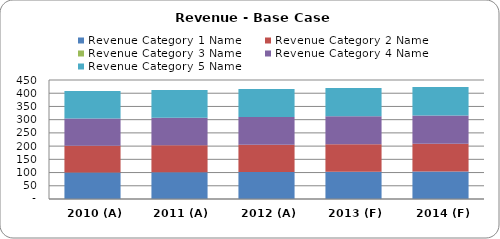
| Category | Revenue Category 1 Name | Revenue Category 2 Name | Revenue Category 3 Name | Revenue Category 4 Name | Revenue Category 5 Name |
|---|---|---|---|---|---|
| 2010 (A)  | 100 | 101 | 0 | 103 | 104 |
| 2011 (A)  | 101 | 102 | 0 | 104 | 105 |
| 2012 (A)  | 102 | 103 | 0 | 105 | 106 |
| 2013 (F)  | 103 | 104 | 0 | 106 | 107 |
| 2014 (F)  | 104 | 105 | 0 | 107 | 108 |